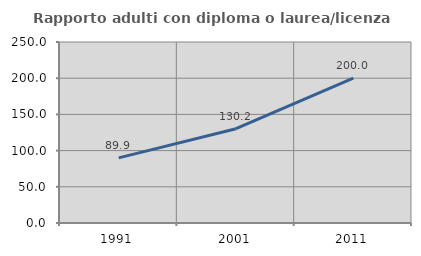
| Category | Rapporto adulti con diploma o laurea/licenza media  |
|---|---|
| 1991.0 | 89.913 |
| 2001.0 | 130.186 |
| 2011.0 | 200.038 |